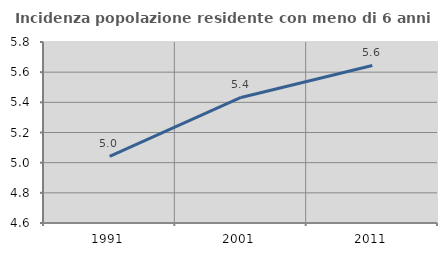
| Category | Incidenza popolazione residente con meno di 6 anni |
|---|---|
| 1991.0 | 5.041 |
| 2001.0 | 5.432 |
| 2011.0 | 5.645 |